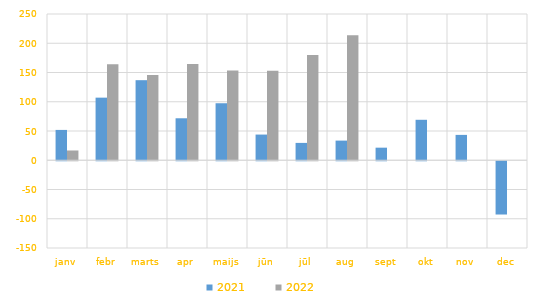
| Category | 2021 | 2022 |
|---|---|---|
| janv | 51841.777 | 16703.923 |
| febr | 107011.894 | 164205.671 |
| marts | 136866.315 | 145513.563 |
| apr | 71755.584 | 164636.583 |
| maijs | 97451.146 | 153483.094 |
| jūn | 43904.827 | 152800.466 |
| jūl | 29653.452 | 179788.756 |
| aug | 33579 | 213558.674 |
| sept | 21501.571 | 0 |
| okt | 69163.685 | 0 |
| nov | 43347 | 0 |
| dec | -91047.788 | 0 |